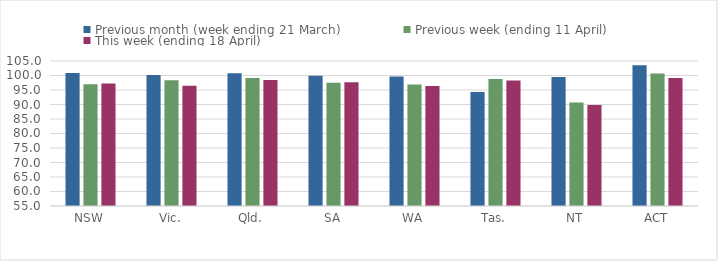
| Category | Previous month (week ending 21 March) | Previous week (ending 11 April) | This week (ending 18 April) |
|---|---|---|---|
| NSW | 100.836 | 96.974 | 97.232 |
| Vic. | 100.174 | 98.368 | 96.467 |
| Qld. | 100.757 | 99.173 | 98.47 |
| SA | 99.952 | 97.516 | 97.652 |
| WA | 99.659 | 96.906 | 96.391 |
| Tas. | 94.318 | 98.765 | 98.315 |
| NT | 99.515 | 90.697 | 89.865 |
| ACT | 103.497 | 100.699 | 99.098 |